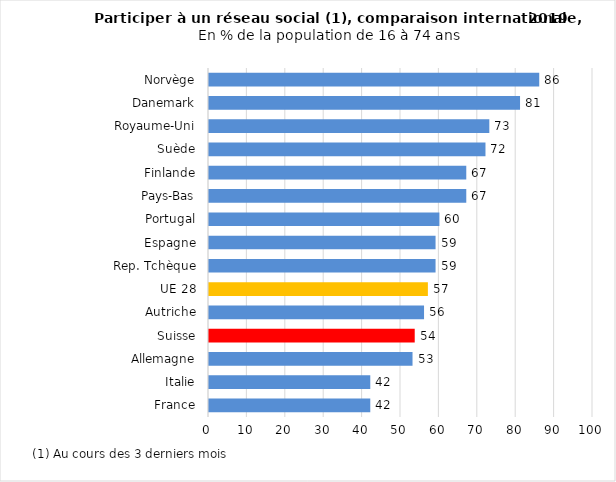
| Category | Series 0 |
|---|---|
| France | 42 |
| Italie | 42 |
| Allemagne | 53 |
| Suisse | 53.573 |
| Autriche | 56 |
| UE 28 | 57 |
| Rep. Tchèque | 59 |
| Espagne | 59 |
| Portugal | 60 |
| Pays-Bas | 67 |
| Finlande | 67 |
| Suède | 72 |
| Royaume-Uni | 73 |
| Danemark | 81 |
| Norvège | 86 |